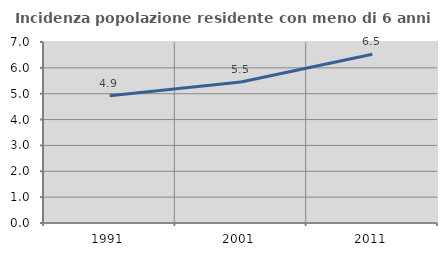
| Category | Incidenza popolazione residente con meno di 6 anni |
|---|---|
| 1991.0 | 4.917 |
| 2001.0 | 5.454 |
| 2011.0 | 6.525 |